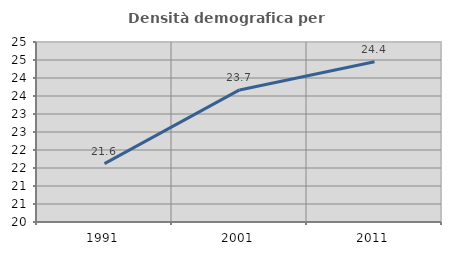
| Category | Densità demografica |
|---|---|
| 1991.0 | 21.621 |
| 2001.0 | 23.669 |
| 2011.0 | 24.449 |